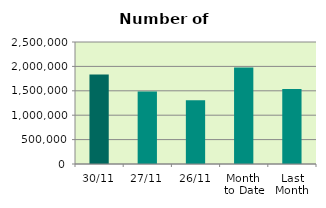
| Category | Series 0 |
|---|---|
| 30/11 | 1834176 |
| 27/11 | 1486386 |
| 26/11 | 1306334 |
| Month 
to Date | 1976001.238 |
| Last
Month | 1538680.909 |